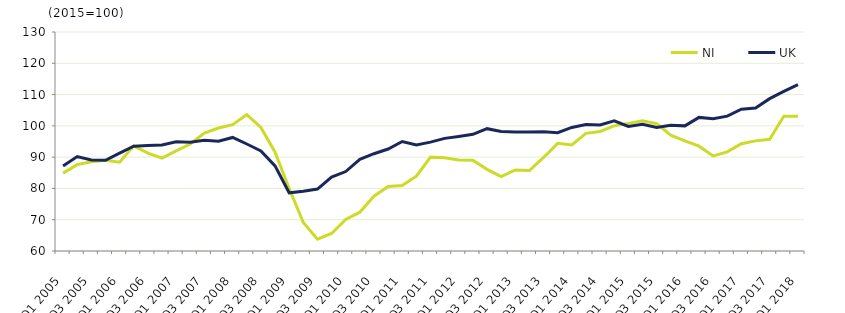
| Category | NI  | UK  |
|---|---|---|
| Q1 2005 | 84.9 | 87.2 |
|  | 87.6 | 90.2 |
| Q3 2005 | 88.5 | 89.1 |
|  | 89 | 89 |
| Q1 2006 | 88.4 | 91.3 |
|  | 93.6 | 93.5 |
| Q3 2006 | 91.3 | 93.7 |
|  | 89.7 | 93.9 |
| Q1 2007 | 92 | 94.9 |
|  | 94.2 | 94.8 |
| Q3 2007 | 97.7 | 95.4 |
|  | 99.3 | 95.1 |
| Q1 2008 | 100.4 | 96.3 |
|  | 103.6 | 94.2 |
| Q3 2008 | 99.5 | 92 |
|  | 91.6 | 87.2 |
| Q1 2009 | 80 | 78.6 |
|  | 69.1 | 79.1 |
| Q3 2009 | 63.8 | 79.8 |
|  | 65.6 | 83.6 |
| Q1 2010 | 70.1 | 85.4 |
|  | 72.4 | 89.3 |
| Q3 2010 | 77.5 | 91.1 |
|  | 80.6 | 92.6 |
| Q1 2011 | 80.9 | 95 |
|  | 83.9 | 93.9 |
| Q3 2011 | 90 | 94.8 |
|  | 89.8 | 96 |
| Q1 2012 | 89.1 | 96.6 |
|  | 89 | 97.3 |
| Q3 2012 | 86.1 | 99.1 |
|  | 83.8 | 98.2 |
| Q1 2013 | 85.9 | 98 |
|  | 85.7 | 98 |
| Q3 2013 | 89.9 | 98.1 |
|  | 94.4 | 97.8 |
| Q1 2014 | 93.9 | 99.5 |
|  | 97.6 | 100.4 |
| Q3 2014 | 98.2 | 100.3 |
|  | 100 | 101.6 |
| Q1 2015 | 100.8 | 99.8 |
|  | 101.6 | 100.5 |
| Q3 2015 | 100.7 | 99.5 |
|  | 97 | 100.2 |
| Q1 2016 | 95.2 | 100 |
|  | 93.5 | 102.7 |
| Q3 2016 | 90.4 | 102.3 |
|  | 91.7 | 103.1 |
| Q1 2017 | 94.3 | 105.3 |
|  | 95.2 | 105.7 |
| Q3 2017 | 95.7 | 108.7 |
|  | 103.1 | 111 |
| Q1 2018 | 103.1 | 113.2 |